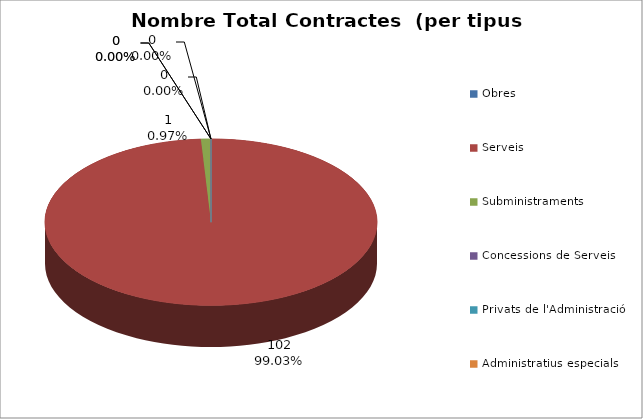
| Category | Nombre Total Contractes |
|---|---|
| Obres | 0 |
| Serveis | 102 |
| Subministraments | 1 |
| Concessions de Serveis | 0 |
| Privats de l'Administració | 0 |
| Administratius especials | 0 |